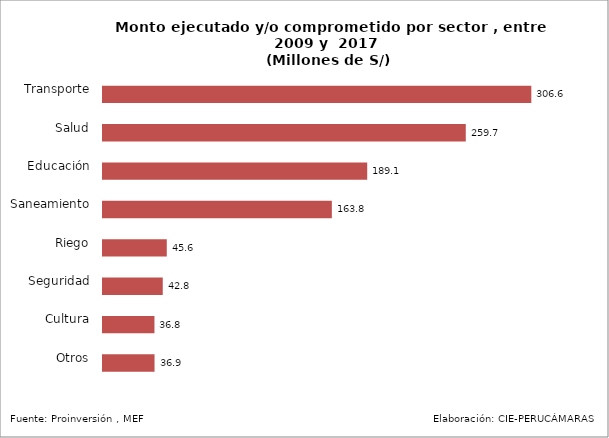
| Category | Series 0 | Series 1 |
|---|---|---|
| Transporte |  | 306.572 |
| Salud |  | 259.664 |
| Educación |  | 189.107 |
| Saneamiento |  | 163.789 |
| Riego |  | 45.65 |
| Seguridad |  | 42.777 |
| Cultura |  | 36.826 |
| Otros |  | 36.888 |